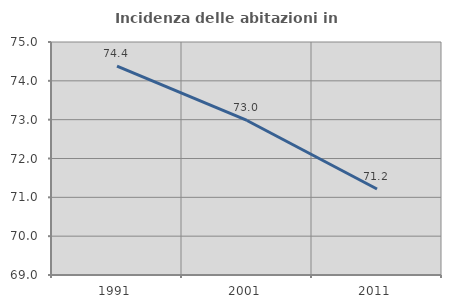
| Category | Incidenza delle abitazioni in proprietà  |
|---|---|
| 1991.0 | 74.378 |
| 2001.0 | 72.979 |
| 2011.0 | 71.215 |